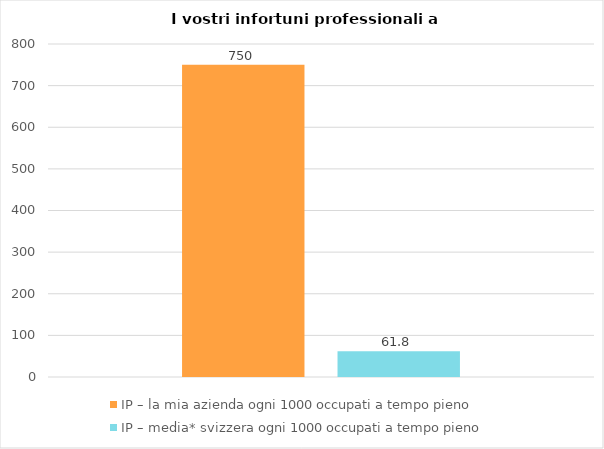
| Category | IP – la mia azienda ogni 1000 occupati a tempo pieno | IP – media* svizzera ogni 1000 occupati a tempo pieno |
|---|---|---|
| Rischio di infortunio 
(valore convertito su 1000 occupati a tempo pieno) | 750 | 61.8 |